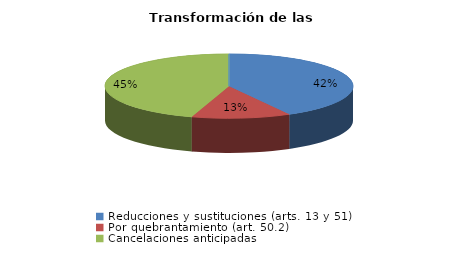
| Category | Series 0 |
|---|---|
| Reducciones y sustituciones (arts. 13 y 51) | 13 |
| Por quebrantamiento (art. 50.2) | 4 |
| Cancelaciones anticipadas | 14 |
| Traslado a Centros Penitenciarios | 0 |
| Conversión internamientos en cerrados (art. 51.2) | 0 |